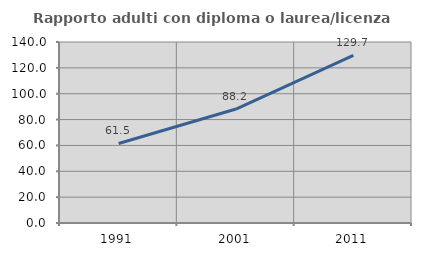
| Category | Rapporto adulti con diploma o laurea/licenza media  |
|---|---|
| 1991.0 | 61.501 |
| 2001.0 | 88.158 |
| 2011.0 | 129.688 |